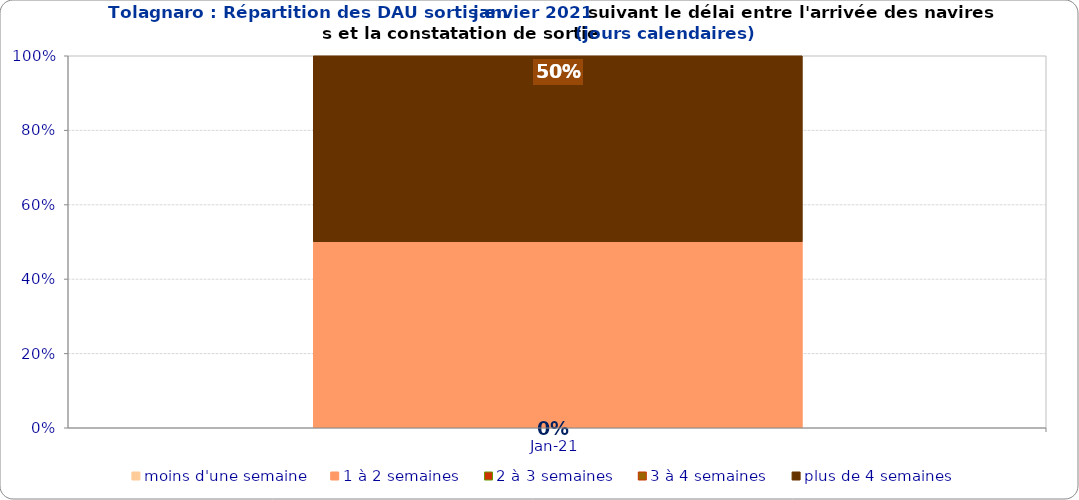
| Category | moins d'une semaine | 1 à 2 semaines | 2 à 3 semaines | 3 à 4 semaines | plus de 4 semaines |
|---|---|---|---|---|---|
| 2021-01-01 | 0 | 0.5 | 0 | 0 | 0.5 |